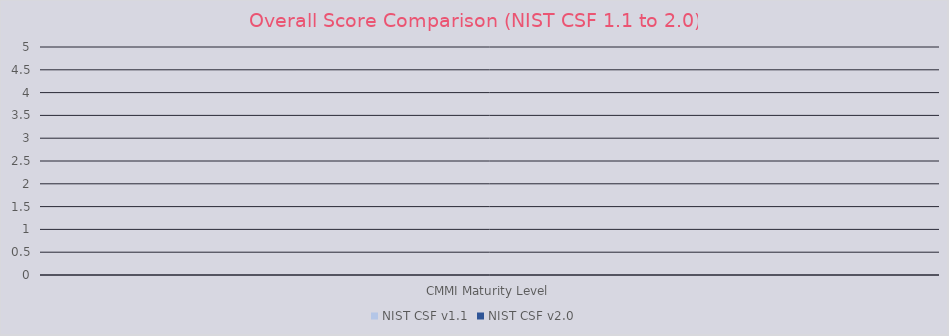
| Category | NIST CSF v1.1 | NIST CSF v2.0 |
|---|---|---|
| CMMI Maturity Level | 0 | 0 |